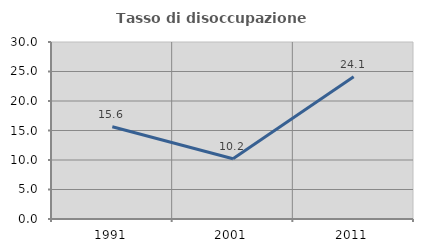
| Category | Tasso di disoccupazione giovanile  |
|---|---|
| 1991.0 | 15.625 |
| 2001.0 | 10.219 |
| 2011.0 | 24.095 |